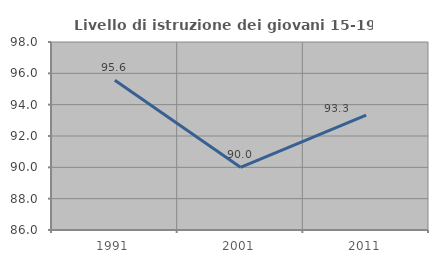
| Category | Livello di istruzione dei giovani 15-19 anni |
|---|---|
| 1991.0 | 95.556 |
| 2001.0 | 90 |
| 2011.0 | 93.333 |